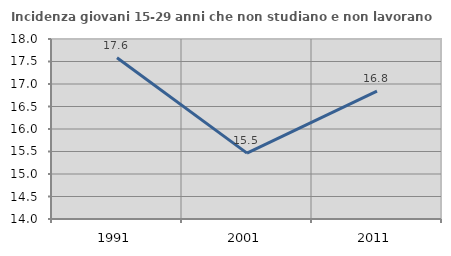
| Category | Incidenza giovani 15-29 anni che non studiano e non lavorano  |
|---|---|
| 1991.0 | 17.582 |
| 2001.0 | 15.464 |
| 2011.0 | 16.842 |